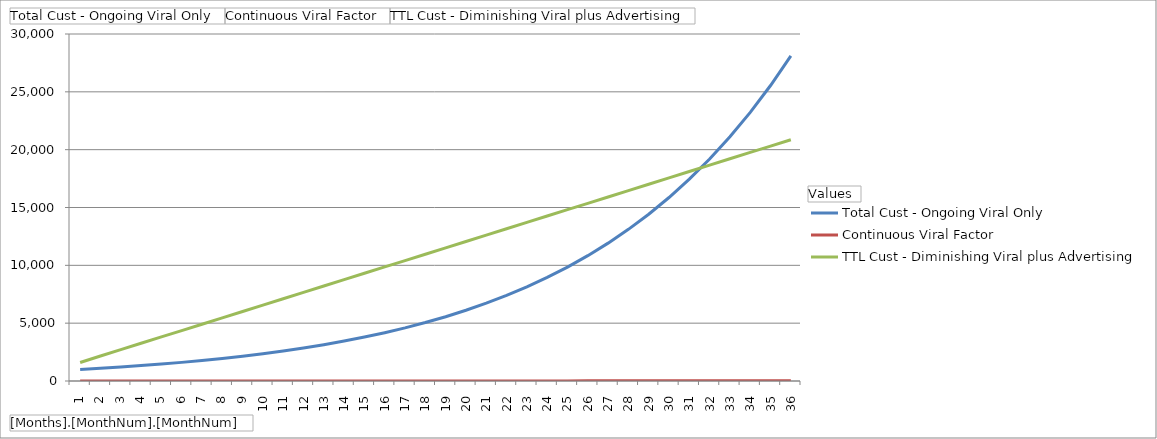
| Category | Total Cust - Ongoing Viral Only | Continuous Viral Factor | TTL Cust - Diminishing Viral plus Advertising |
|---|---|---|---|
| 1 | 1000 | 1 | 1600 |
| 2 | 1100 | 1.1 | 2160 |
| 3 | 1210 | 1.21 | 2711 |
| 4 | 1331 | 1.331 | 3261.1 |
| 5 | 1464.1 | 1.464 | 3811.11 |
| 6 | 1610.51 | 1.611 | 4361.111 |
| 7 | 1771.561 | 1.772 | 4911.111 |
| 8 | 1948.717 | 1.949 | 5461.111 |
| 9 | 2143.589 | 2.144 | 6011.111 |
| 10 | 2357.948 | 2.358 | 6561.111 |
| 11 | 2593.742 | 2.594 | 7111.111 |
| 12 | 2853.117 | 2.853 | 7661.111 |
| 13 | 3138.428 | 3.138 | 8211.111 |
| 14 | 3452.271 | 3.452 | 8761.111 |
| 15 | 3797.498 | 3.797 | 9311.111 |
| 16 | 4177.248 | 4.177 | 9861.111 |
| 17 | 4594.973 | 4.595 | 10411.111 |
| 18 | 5054.47 | 5.054 | 10961.111 |
| 19 | 5559.917 | 5.56 | 11511.111 |
| 20 | 6115.909 | 6.116 | 12061.111 |
| 21 | 6727.5 | 6.727 | 12611.111 |
| 22 | 7400.25 | 7.4 | 13161.111 |
| 23 | 8140.275 | 8.14 | 13711.111 |
| 24 | 8954.302 | 8.954 | 14261.111 |
| 25 | 9849.733 | 9.85 | 14811.111 |
| 26 | 10834.706 | 10.835 | 15361.111 |
| 27 | 11918.177 | 11.918 | 15911.111 |
| 28 | 13109.994 | 13.11 | 16461.111 |
| 29 | 14420.994 | 14.421 | 17011.111 |
| 30 | 15863.093 | 15.863 | 17561.111 |
| 31 | 17449.402 | 17.449 | 18111.111 |
| 32 | 19194.342 | 19.194 | 18661.111 |
| 33 | 21113.777 | 21.114 | 19211.111 |
| 34 | 23225.154 | 23.225 | 19761.111 |
| 35 | 25547.67 | 25.548 | 20311.111 |
| 36 | 28102.437 | 28.102 | 20861.111 |